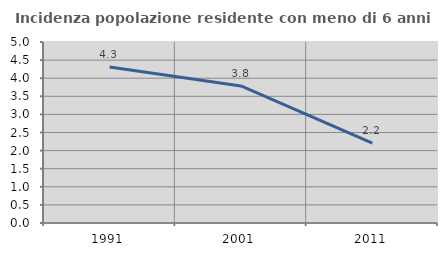
| Category | Incidenza popolazione residente con meno di 6 anni |
|---|---|
| 1991.0 | 4.31 |
| 2001.0 | 3.785 |
| 2011.0 | 2.206 |